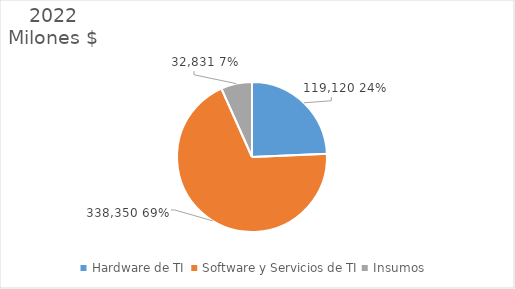
| Category | 2022 |
|---|---|
| Hardware de TI  | 119120 |
| Software y Servicios de TI | 338350 |
| Insumos  | 32831 |